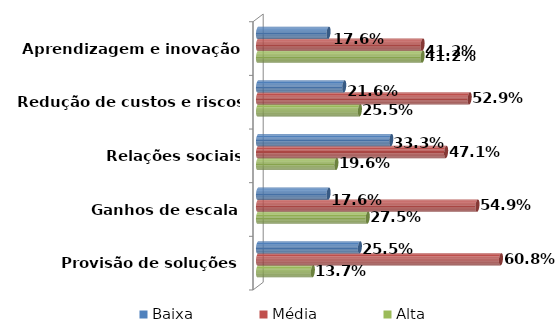
| Category | Baixa | Média | Alta |
|---|---|---|---|
| Aprendizagem e inovação | 0.176 | 0.412 | 0.412 |
| Redução de custos e riscos | 0.216 | 0.529 | 0.255 |
| Relações sociais (cooperação) | 0.333 | 0.471 | 0.196 |
| Ganhos de escala | 0.176 | 0.549 | 0.275 |
| Provisão de soluções | 0.255 | 0.608 | 0.137 |